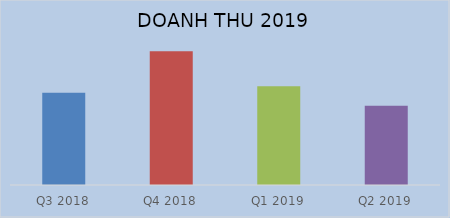
| Category | Doanh thu thuần |
|---|---|
| Q3 2018 | 12712852102754 |
| Q4 2018 | 18453063267284 |
| Q1 2019 | 13636768648167 |
| Q2 2019 | 10919682134602 |